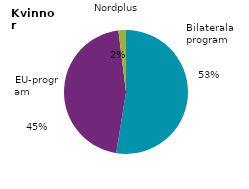
| Category | Series 0 |
|---|---|
| Bilaterala program                                 | 2245 |
| EU-program                                         | 1945 |
| Nordplus                                           | 84 |